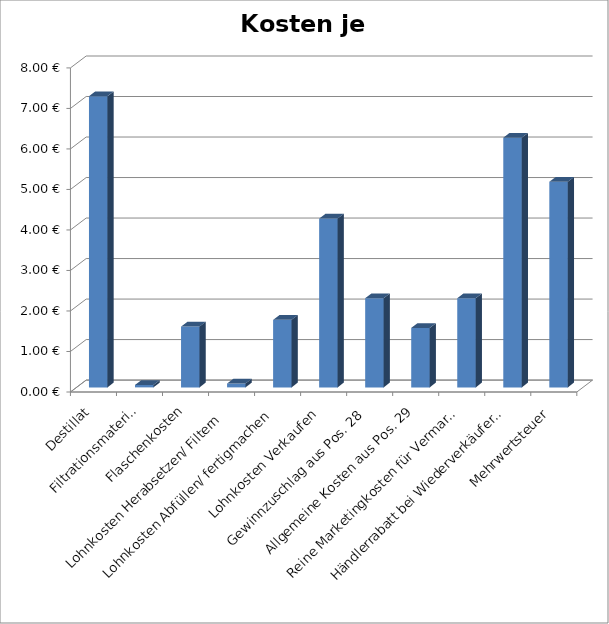
| Category | Kosten je Flasche |
|---|---|
| Destillat | 7.188 |
| Filtrationsmaterial | 0.06 |
| Flaschenkosten | 1.5 |
| Lohnkosten Herabsetzen/ Filtern  | 0.095 |
| Lohnkosten Abfüllen/ fertigmachen | 1.667 |
| Lohnkosten Verkaufen | 4.167 |
| Gewinnzuschlag aus Pos. 28 | 2.202 |
| Allgemeine Kosten aus Pos. 29 | 1.468 |
| Reine Marketingkosten für Vermarktung Pos.30 | 2.202 |
| Händlerrabatt bei Wiederverkäufer Pos 31 | 6.164 |
| Mehrwertsteuer | 5.075 |